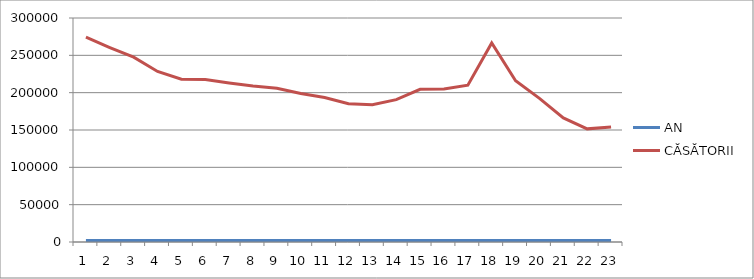
| Category | AN | CĂSĂTORII |
|---|---|---|
| 0 | 1990 | 274239 |
| 1 | 1991 | 260476 |
| 2 | 1992 | 247477 |
| 3 | 1993 | 228374 |
| 4 | 1994 | 218042 |
| 5 | 1995 | 217551 |
| 6 | 1996 | 213023 |
| 7 | 1997 | 208803 |
| 8 | 1998 | 206034 |
| 9 | 1999 | 198887 |
| 10 | 2000 | 193587 |
| 11 | 2001 | 185197 |
| 12 | 2002 | 183823 |
| 13 | 2003 | 190690 |
| 14 | 2004 | 204464 |
| 15 | 2005 | 204802 |
| 16 | 2006 | 210059 |
| 17 | 2007 | 266468 |
| 18 | 2008 | 215944 |
| 19 | 2009 | 192352 |
| 20 | 2010 | 166175 |
| 21 | 2011 | 151521 |
| 22 | 2012 | 154070 |